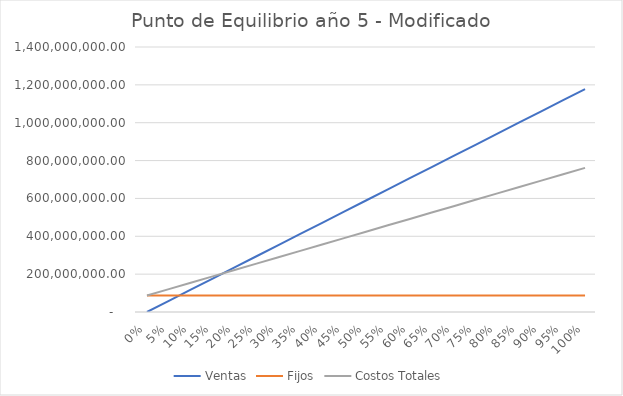
| Category | Ventas | Fijos | Costos Totales |
|---|---|---|---|
| 0.0 | 0 | 87019747.624 | 87019747.624 |
| 0.05 | 58899456 | 87019747.624 | 120738955.214 |
| 0.1 | 117798912 | 87019747.624 | 154458162.804 |
| 0.15 | 176698368 | 87019747.624 | 188177370.394 |
| 0.2 | 235597824 | 87019747.624 | 221896577.984 |
| 0.25 | 294497280 | 87019747.624 | 255615785.574 |
| 0.3 | 353396736 | 87019747.624 | 289334993.164 |
| 0.35 | 412296192 | 87019747.624 | 323054200.754 |
| 0.4 | 471195648 | 87019747.624 | 356773408.344 |
| 0.45 | 530095104 | 87019747.624 | 390492615.934 |
| 0.5 | 588994560 | 87019747.624 | 424211823.523 |
| 0.55 | 647894016 | 87019747.624 | 457931031.113 |
| 0.6 | 706793472 | 87019747.624 | 491650238.703 |
| 0.65 | 765692928 | 87019747.624 | 525369446.293 |
| 0.7 | 824592384 | 87019747.624 | 559088653.883 |
| 0.75 | 883491840 | 87019747.624 | 592807861.473 |
| 0.8 | 942391296 | 87019747.624 | 626527069.063 |
| 0.85 | 1001290752 | 87019747.624 | 660246276.653 |
| 0.9 | 1060190208 | 87019747.624 | 693965484.243 |
| 0.95 | 1119089664 | 87019747.624 | 727684691.833 |
| 1.0 | 1177989120 | 87019747.624 | 761403899.423 |